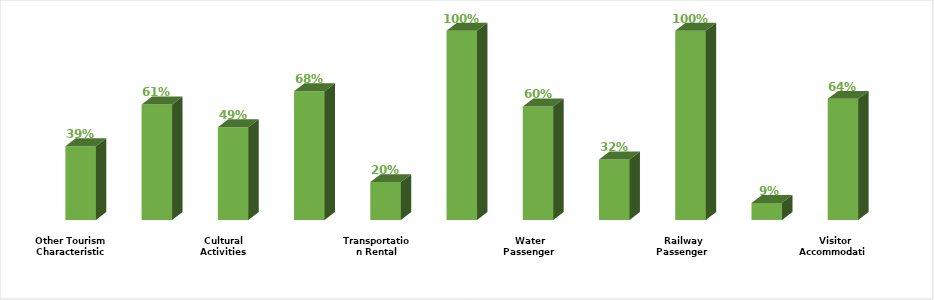
| Category | Series 0 |
|---|---|
|  Visitor Accommodation | 0.64 |
| Food and Beverage | 0.09 |
|  Railway Passenger Transport | 1 |
|  Land Passenger Transport | 0.32 |
|  Water Passenger Transport | 0.6 |
|  Air Passenger Transport | 1 |
|  Transportation Rental | 0.2 |
|   Travel Agencies and Reservation Services | 0.68 |
| Cultural Activities | 0.49 |
| Sports and Recreational Activities | 0.61 |
| Other Tourism Characteristic Services  | 0.39 |